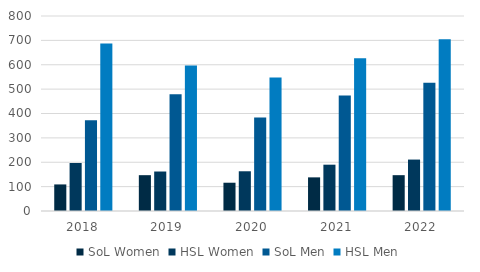
| Category | SoL | HSL |
|---|---|---|
| 2018.0 | 372 | 687 |
| 2019.0 | 479 | 597 |
| 2020.0 | 384 | 548 |
| 2021.0 | 474 | 627 |
| 2022.0 | 526 | 705 |